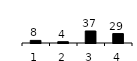
| Category | Series 0 |
|---|---|
| 1.0 | 8 |
| 2.0 | 4 |
| 3.0 | 37 |
| 4.0 | 29 |